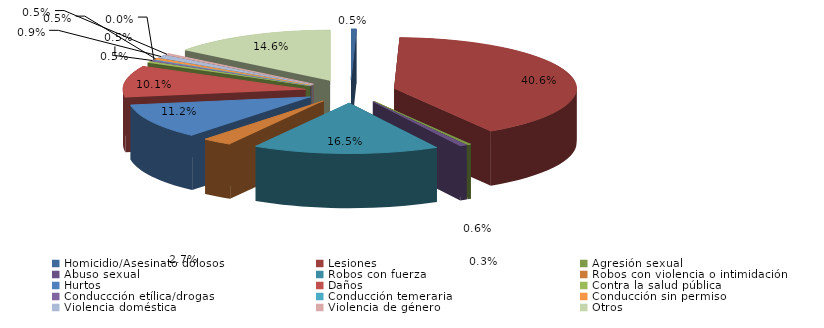
| Category | Series 0 |
|---|---|
| Homicidio/Asesinato dolosos | 3 |
| Lesiones | 258 |
| Agresión sexual | 2 |
| Abuso sexual | 4 |
| Robos con fuerza | 105 |
| Robos con violencia o intimidación | 17 |
| Hurtos | 71 |
| Daños | 64 |
| Contra la salud pública | 3 |
| Conduccción etílica/drogas | 3 |
| Conducción temeraria | 0 |
| Conducción sin permiso | 3 |
| Violencia doméstica | 6 |
| Violencia de género | 3 |
| Otros | 93 |